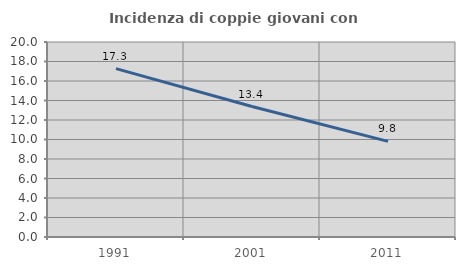
| Category | Incidenza di coppie giovani con figli |
|---|---|
| 1991.0 | 17.266 |
| 2001.0 | 13.382 |
| 2011.0 | 9.812 |